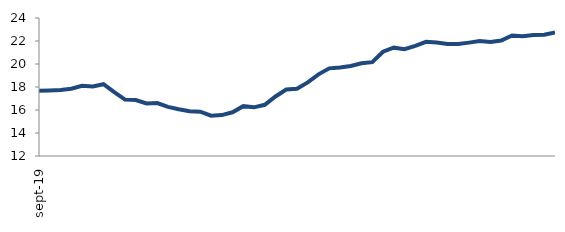
| Category | Series 0 |
|---|---|
| 2019-09-01 | 17.666 |
| 2019-10-01 | 17.704 |
| 2019-11-01 | 17.747 |
| 2019-12-01 | 17.844 |
| 2020-01-01 | 18.099 |
| 2020-02-01 | 18.039 |
| 2020-03-01 | 18.244 |
| 2020-04-01 | 17.551 |
| 2020-05-01 | 16.911 |
| 2020-06-01 | 16.867 |
| 2020-07-01 | 16.563 |
| 2020-08-01 | 16.602 |
| 2020-09-01 | 16.272 |
| 2020-10-01 | 16.069 |
| 2020-11-01 | 15.889 |
| 2020-12-01 | 15.855 |
| 2021-01-01 | 15.501 |
| 2021-02-01 | 15.555 |
| 2021-03-01 | 15.803 |
| 2021-04-01 | 16.335 |
| 2021-05-01 | 16.232 |
| 2021-06-01 | 16.452 |
| 2021-07-01 | 17.177 |
| 2021-08-01 | 17.778 |
| 2021-09-01 | 17.842 |
| 2021-10-01 | 18.396 |
| 2021-11-01 | 19.101 |
| 2021-12-01 | 19.622 |
| 2022-01-01 | 19.702 |
| 2022-02-01 | 19.825 |
| 2022-03-01 | 20.061 |
| 2022-04-01 | 20.163 |
| 2022-05-01 | 21.067 |
| 2022-06-01 | 21.42 |
| 2022-07-01 | 21.282 |
| 2022-08-01 | 21.579 |
| 2022-09-01 | 21.932 |
| 2022-10-01 | 21.875 |
| 2022-11-01 | 21.741 |
| 2022-12-01 | 21.732 |
| 2023-01-01 | 21.858 |
| 2023-02-01 | 21.995 |
| 2023-03-01 | 21.919 |
| 2023-04-01 | 22.045 |
| 2023-05-01 | 22.483 |
| 2023-06-01 | 22.416 |
| 2023-07-01 | 22.523 |
| 2023-08-01 | 22.55 |
| 2023-09-01 | 22.733 |